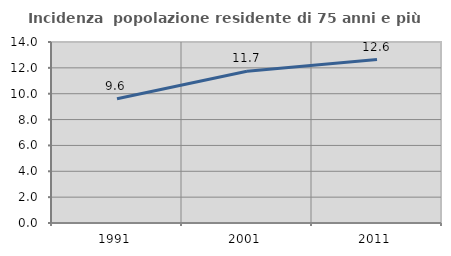
| Category | Incidenza  popolazione residente di 75 anni e più |
|---|---|
| 1991.0 | 9.605 |
| 2001.0 | 11.74 |
| 2011.0 | 12.643 |